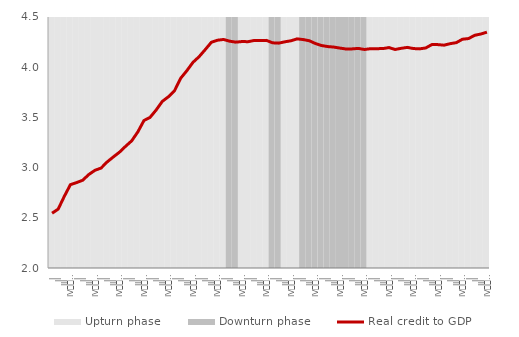
| Category | Upturn phase | Downturn phase |
|---|---|---|
| I | 1 | 0 |
| II | 1 | 0 |
| III | 1 | 0 |
| IV
2002 | 1 | 0 |
| I | 1 | 0 |
| II | 1 | 0 |
| III | 1 | 0 |
| IV
2003 | 1 | 0 |
| I | 1 | 0 |
| II | 1 | 0 |
| III | 1 | 0 |
| IV
2004 | 1 | 0 |
| I | 1 | 0 |
| II | 1 | 0 |
| III | 1 | 0 |
| IV
2005 | 1 | 0 |
| I | 1 | 0 |
| II | 1 | 0 |
| III | 1 | 0 |
| IV
2006 | 1 | 0 |
| I | 1 | 0 |
| II | 1 | 0 |
| III | 1 | 0 |
| IV
2007 | 1 | 0 |
| I | 1 | 0 |
| II | 1 | 0 |
| III | 1 | 0 |
| IV
2008 | 1 | 0 |
| I | 1 | 0 |
| II | 0 | 1 |
| III | 0 | 1 |
| IV
2009 | 1 | 0 |
| I | 1 | 0 |
| II | 1 | 0 |
| III | 1 | 0 |
| IV
2010 | 1 | 0 |
| I | 0 | 1 |
| II | 0 | 1 |
| III | 1 | 0 |
| IV
2011 | 1 | 0 |
| I | 1 | 0 |
| II | 0 | 1 |
| III | 0 | 1 |
| IV
2012 | 0 | 1 |
| I | 0 | 1 |
| II | 0 | 1 |
| III | 0 | 1 |
| IV
2013 | 0 | 1 |
| I | 0 | 1 |
| II | 0 | 1 |
| III | 0 | 1 |
| IV
2014 | 0 | 1 |
| I | 1 | 0 |
| II | 1 | 0 |
| III | 1 | 0 |
| IV
2015 | 1 | 0 |
| I | 1 | 0 |
| II | 1 | 0 |
| III | 1 | 0 |
| IV
2016 | 1 | 0 |
| I | 1 | 0 |
| II | 1 | 0 |
| III | 1 | 0 |
| IV
2017 | 1 | 0 |
| I | 1 | 0 |
| II | 1 | 0 |
| III | 1 | 0 |
| IV
2018 | 1 | 0 |
| I | 1 | 0 |
| II | 1 | 0 |
| III | 1 | 0 |
| IV
2019 | 1 | 0 |